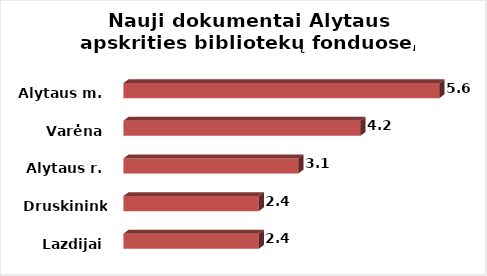
| Category | Series 0 |
|---|---|
| Lazdijai | 2.4 |
| Druskininkai | 2.4 |
| Alytaus r. | 3.1 |
| Varėna | 4.2 |
| Alytaus m. | 5.6 |